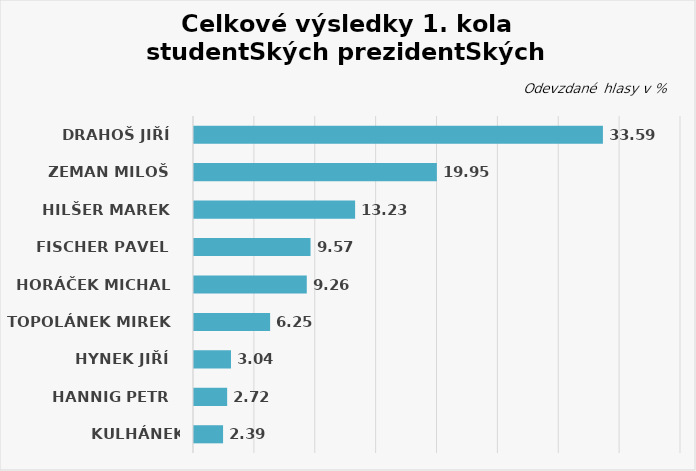
| Category | Series 0 |
|---|---|
| Drahoš Jiří   | 33.587 |
| Zeman Miloš   | 19.948 |
| Hilšer Marek   | 13.233 |
| Fischer Pavel   | 9.571 |
| Horáček Michal   | 9.263 |
| Topolánek Mirek   | 6.251 |
| Hynek Jiří   | 3.037 |
| Hannig Petr   | 2.723 |
| Kulhánek Vratislav   | 2.388 |